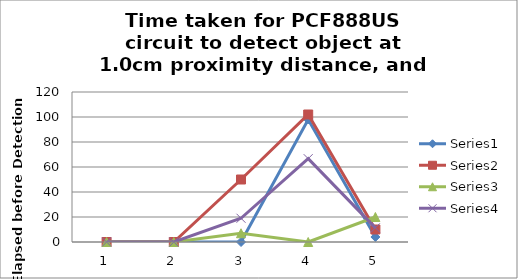
| Category | Series 0 | Series 1 | Series 2 | Series 3 |
|---|---|---|---|---|
| 0 | 0 | 0 | 0 | 0 |
| 1 | 0 | 0 | 0 | 0 |
| 2 | 0 | 50 | 7 | 19 |
| 3 | 98 | 102 | 0 | 66.667 |
| 4 | 4 | 10 | 20 | 11.333 |